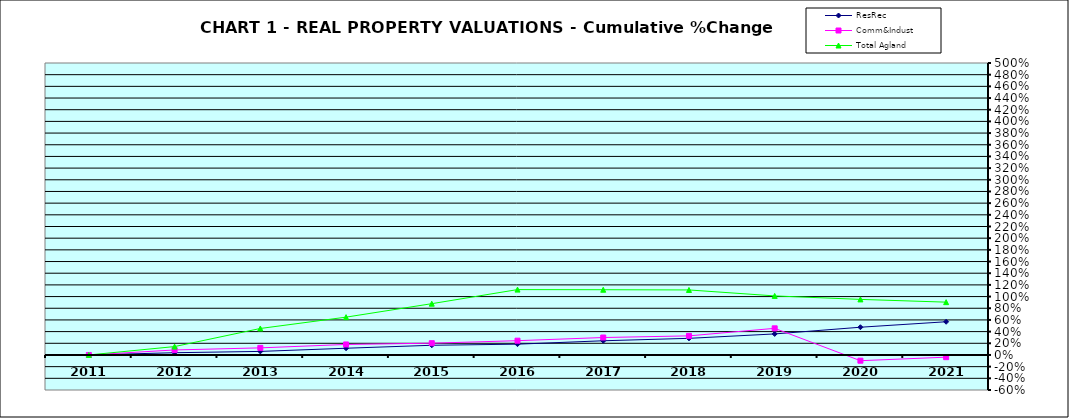
| Category | ResRec | Comm&Indust | Total Agland |
|---|---|---|---|
| 2011.0 | 0 | 0 | 0 |
| 2012.0 | 0.038 | 0.086 | 0.144 |
| 2013.0 | 0.061 | 0.122 | 0.454 |
| 2014.0 | 0.115 | 0.18 | 0.648 |
| 2015.0 | 0.166 | 0.202 | 0.878 |
| 2016.0 | 0.185 | 0.245 | 1.119 |
| 2017.0 | 0.243 | 0.299 | 1.117 |
| 2018.0 | 0.285 | 0.327 | 1.114 |
| 2019.0 | 0.36 | 0.456 | 1.011 |
| 2020.0 | 0.475 | -0.098 | 0.952 |
| 2021.0 | 0.569 | -0.038 | 0.904 |